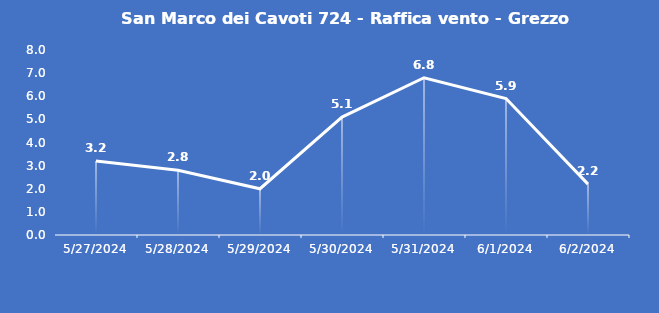
| Category | San Marco dei Cavoti 724 - Raffica vento - Grezzo (m/s) |
|---|---|
| 5/27/24 | 3.2 |
| 5/28/24 | 2.8 |
| 5/29/24 | 2 |
| 5/30/24 | 5.1 |
| 5/31/24 | 6.8 |
| 6/1/24 | 5.9 |
| 6/2/24 | 2.2 |